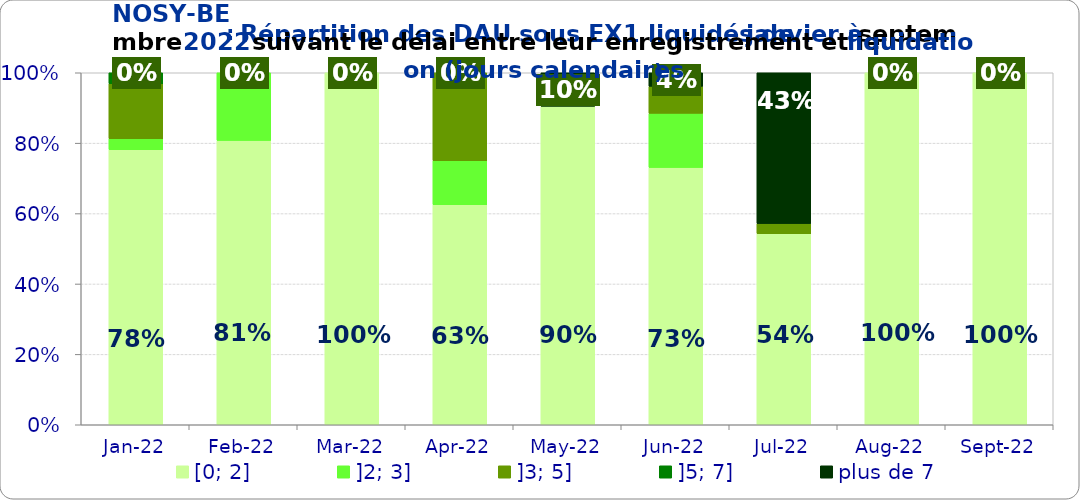
| Category | [0; 2] | ]2; 3] | ]3; 5] | ]5; 7] | plus de 7 |
|---|---|---|---|---|---|
| 2022-01-01 | 0.781 | 0.031 | 0.156 | 0.031 | 0 |
| 2022-02-01 | 0.808 | 0.192 | 0 | 0 | 0 |
| 2022-03-01 | 1 | 0 | 0 | 0 | 0 |
| 2022-04-01 | 0.625 | 0.125 | 0.25 | 0 | 0 |
| 2022-05-01 | 0.905 | 0 | 0 | 0 | 0.095 |
| 2022-06-01 | 0.731 | 0.154 | 0.077 | 0 | 0.038 |
| 2022-07-01 | 0.543 | 0 | 0.029 | 0 | 0.429 |
| 2022-08-01 | 1 | 0 | 0 | 0 | 0 |
| 2022-09-01 | 1 | 0 | 0 | 0 | 0 |